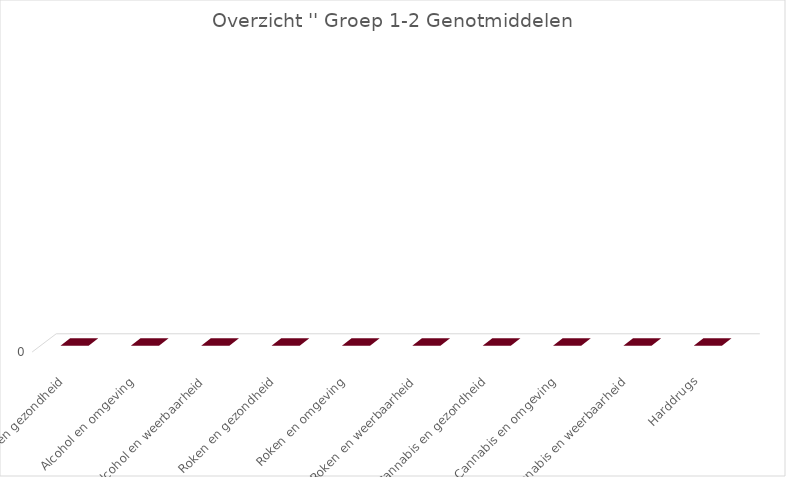
| Category | Series 2 |
|---|---|
| Alcohol en gezondheid | 0 |
| Alcohol en omgeving | 0 |
| Alcohol en weerbaarheid | 0 |
| Roken en gezondheid | 0 |
| Roken en omgeving | 0 |
| Roken en weerbaarheid | 0 |
| Cannabis en gezondheid | 0 |
| Cannabis en omgeving | 0 |
| Cannabis en weerbaarheid | 0 |
| Harddrugs | 0 |